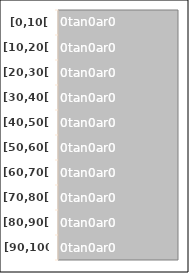
| Category | [0,10[ [10,20[ [20,30[ [30,40[ [40,50[ [50,60[ [60,70[ [70,80[ [80,90[ [90,100] |
|---|---|
| [0,10[ | 0 |
| [10,20[ | 0 |
| [20,30[ | 0 |
| [30,40[ | 0 |
| [40,50[ | 0 |
| [50,60[ | 0 |
| [60,70[ | 0 |
| [70,80[ | 0 |
| [80,90[ | 0 |
| [90,100] | 0 |